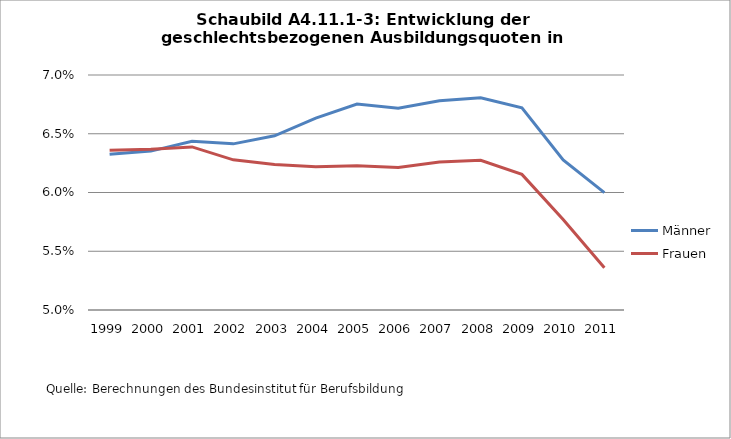
| Category | Männer | Frauen |
|---|---|---|
| 1999.0 | 0.063 | 0.064 |
| 2000.0 | 0.064 | 0.064 |
| 2001.0 | 0.064 | 0.064 |
| 2002.0 | 0.064 | 0.063 |
| 2003.0 | 0.065 | 0.062 |
| 2004.0 | 0.066 | 0.062 |
| 2005.0 | 0.068 | 0.062 |
| 2006.0 | 0.067 | 0.062 |
| 2007.0 | 0.068 | 0.063 |
| 2008.0 | 0.068 | 0.063 |
| 2009.0 | 0.067 | 0.062 |
| 2010.0 | 0.063 | 0.058 |
| 2011.0 | 0.06 | 0.054 |